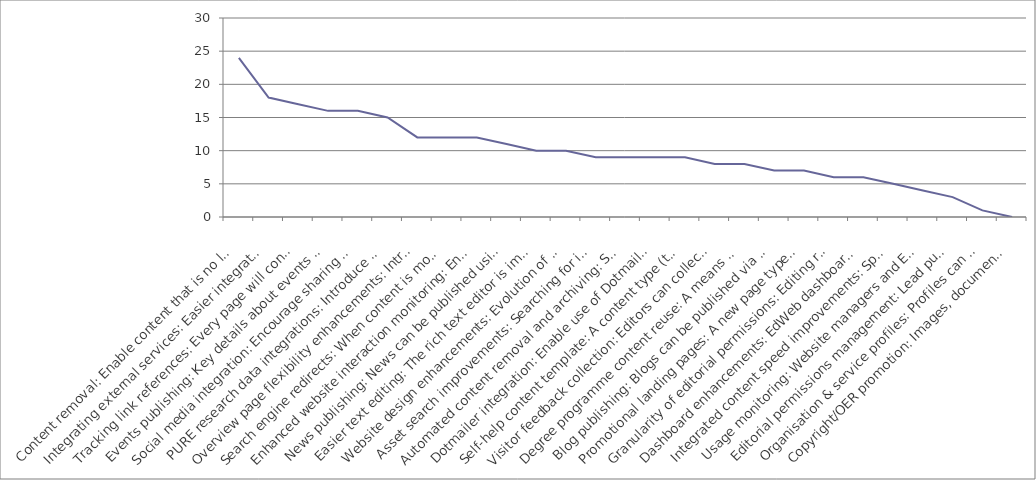
| Category | Series 0 |
|---|---|
| Content removal: Enable content that is no longer required or created in error to be removable, reducing unnecessary clutter in the EdWeb content tree for editors. | 24 |
| Integrating external services: Easier integration of services such as Google Maps, You Tube videos, Twitter feeds. Simple URL pasting into EdWeb with no need for interaction with HTML or assets. | 18 |
| Tracking link references: Every page will contain a list of all other EdWeb pages that link to it, so that when it is edited, moved or removed the editor is aware of the impact of their actions on other publishers across the University. | 17 |
| Events publishing: Key details about events can be displayed differently in different contexts, such as the automatic creation of an events calendar. | 16 |
| Social media integration: Encourage sharing of website content via social media buttons, and features to monitor engagement on popular networks. | 16 |
| PURE research data integrations: Introduce more opportunities to present information from the Edinburgh Research Explorer in EdWeb-managed web pages, with no technical knowledge needed. (Currently only publication lists possible). | 15 |
| Overview page flexibility enhancements: Introduce new layout options to enable overview pages to dynamically present the content below in a range of ways. | 12 |
| Search engine redirects: When content is moved or removed, enable 301 redirects. This reduces the risk of a website visitor receiving a 'Page not found' error from a search result in the period before the site is re-indexed. | 12 |
| Enhanced website interaction monitoring: Enable use of analytics tools (click heat tracking, A/B testing etc) that provide additional insight into how website visitors are interacting with the website. This informs ongoing content & design improvements. | 12 |
| News publishing: News can be published using a dedicated content type (template); enhancing presentation on different device sizes, allowing more intelligent sharing and promotion in search results. | 11 |
| Easier text editing: The rich text editor is improved, so that it's quicker and easier to make changes to content, to apply stand-out formatting elements and to ensure everything is standards compliant. | 10 |
| Website design enhancements: Evolution of design to improve website visitor experience on small devices, bringing greater focus to content over brand & navigation elements and promoting clearer/easier interactions. | 10 |
| Asset search improvements: Searching for images, documents, videos, content snippets etc is quicker, easier and more efficient. | 9 |
| Automated content removal and archiving: Schedule archiving and permanent removal of unpublished content after given periods to reduce unnecessary clutter and support compliance with records management legislation. | 9 |
| Dotmailer integration: Enable use of Dotmailer through EdWeb as a means to build and manage mailing lists more efficiently. | 9 |
| Self-help content template: A content type (template) optimised for presentation of online help and guidance, supporting user self service. | 9 |
| Visitor feedback collection: Editors can collect and view visitor ratings for page content, to identify strengths and quickly correct any errors. | 8 |
| Degree programme content reuse: A means to re-use and extend golden copy content about degree programmes, that is currently published only via the Degree Finder | 8 |
| Blog publishing: Blogs can be published via EdWeb, with sufficient design changes to distinguish from corporate web content, and new navigation and filtering options typically associated with this kind of content (sort by author, by date, by tag etc). | 7 |
| Promotional landing pages: A new page type designed for promotional impact and flexibility, which can be used at any point in a site structure. It will work much like a Generic Content page, but have presentational features similar to a homepage. | 7 |
| Granularity of editorial permissions: Editing rights can be restricted to particular subsections or content types, rather than having access to everything in a particular site. | 6 |
| Dashboard enhancements: EdWeb dashboard is more useful to editors and publishers, speeding up completion of the most common tasks, and can be configured to suit an individual's priorities. | 6 |
| Integrated content speed improvements: Speed up page load times for content being delivered from external systems through EdWeb. | 5 |
| Usage monitoring: Website managers and EdWeb support services have access to data on editorial and publishing activity, which will support better website management, staffing and user support-related decision making. | 4 |
| Editorial permissions management: Lead publishers can assign editorial rights on their website to any trained user, without involving EdWeb support. | 3 |
| Organisation & service profiles: Profiles can be published using a dedicated content type (template); enhancing presentation on different device sizes, allowing more intelligent sharing and promotion in search results. | 1 |
| Copyright/OER promotion: Images, documents and other assets can be promoted as Open Educational Resources, encouraging reuse of University materials worldwide. | 0 |